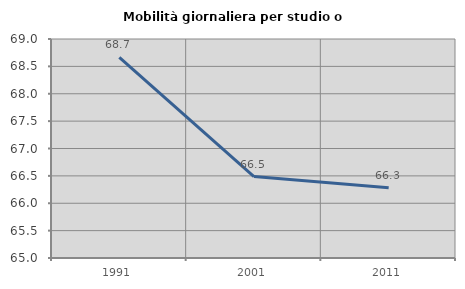
| Category | Mobilità giornaliera per studio o lavoro |
|---|---|
| 1991.0 | 68.665 |
| 2001.0 | 66.488 |
| 2011.0 | 66.282 |